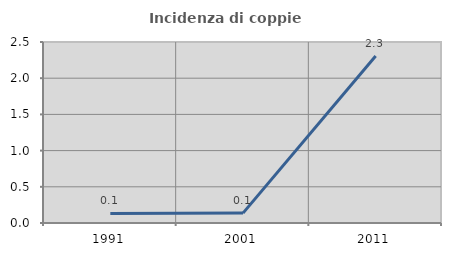
| Category | Incidenza di coppie miste |
|---|---|
| 1991.0 | 0.131 |
| 2001.0 | 0.136 |
| 2011.0 | 2.305 |